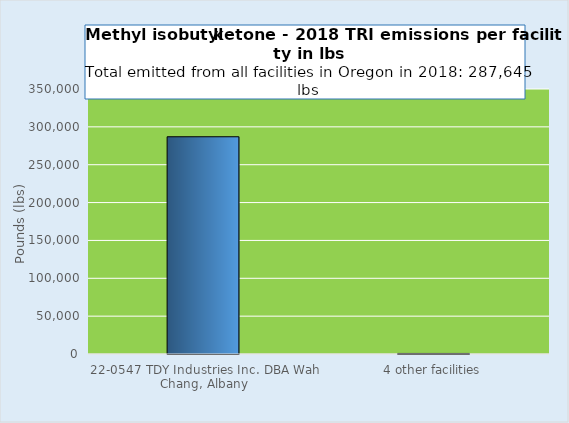
| Category | Series 0 |
|---|---|
| 22-0547 TDY Industries Inc. DBA Wah Chang, Albany | 286929 |
| 4 other facilities | 716 |